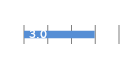
| Category | Series 0 |
|---|---|
| 0 | 2.974 |